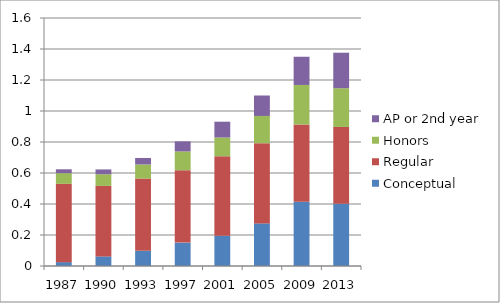
| Category | Conceptual | Regular | Honors | AP or 2nd year |
|---|---|---|---|---|
| 1987.0 | 0.025 | 0.505 | 0.069 | 0.025 |
| 1990.0 | 0.062 | 0.455 | 0.075 | 0.031 |
| 1993.0 | 0.098 | 0.466 | 0.091 | 0.042 |
| 1997.0 | 0.151 | 0.467 | 0.121 | 0.065 |
| 2001.0 | 0.195 | 0.513 | 0.121 | 0.102 |
| 2005.0 | 0.275 | 0.517 | 0.176 | 0.132 |
| 2009.0 | 0.414 | 0.499 | 0.255 | 0.182 |
| 2013.0 | 0.401 | 0.496 | 0.25 | 0.229 |